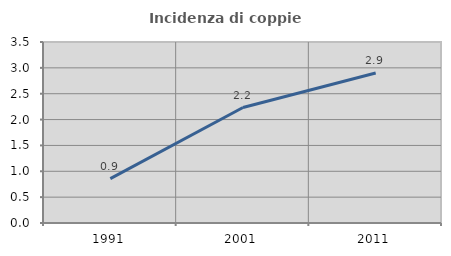
| Category | Incidenza di coppie miste |
|---|---|
| 1991.0 | 0.857 |
| 2001.0 | 2.233 |
| 2011.0 | 2.902 |